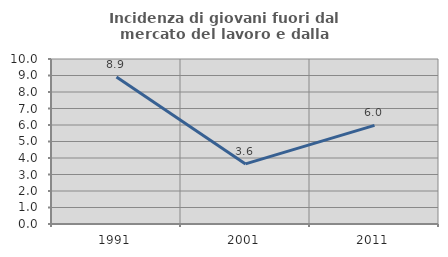
| Category | Incidenza di giovani fuori dal mercato del lavoro e dalla formazione  |
|---|---|
| 1991.0 | 8.904 |
| 2001.0 | 3.641 |
| 2011.0 | 5.975 |